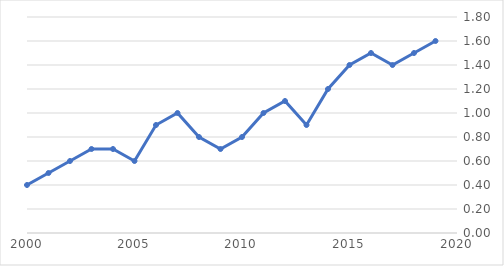
| Category | Series 0 |
|---|---|
| 2000.0 | 0.4 |
| 2001.0 | 0.5 |
| 2002.0 | 0.6 |
| 2003.0 | 0.7 |
| 2004.0 | 0.7 |
| 2005.0 | 0.6 |
| 2006.0 | 0.9 |
| 2007.0 | 1 |
| 2008.0 | 0.8 |
| 2009.0 | 0.7 |
| 2010.0 | 0.8 |
| 2011.0 | 1 |
| 2012.0 | 1.1 |
| 2013.0 | 0.9 |
| 2014.0 | 1.2 |
| 2015.0 | 1.4 |
| 2016.0 | 1.5 |
| 2017.0 | 1.4 |
| 2018.0 | 1.5 |
| 2019.0 | 1.6 |